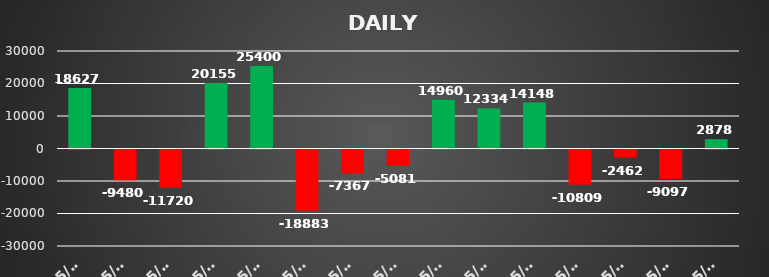
| Category | Series 0 |
|---|---|
| 2021-05-03 | 18626.5 |
| 2021-05-04 | -9480.044 |
| 2021-05-05 | -11720.077 |
| 2021-05-06 | 20155.15 |
| 2021-05-07 | 25399.875 |
| 2021-05-10 | -18883.345 |
| 2021-05-18 | -7366.725 |
| 2021-05-19 | -5081.13 |
| 2021-05-21 | 14959.934 |
| 2021-05-24 | 12334.476 |
| 2021-05-25 | 14147.7 |
| 2021-05-26 | -10809.025 |
| 2021-05-27 | -2462.376 |
| 2021-05-28 | -9097.371 |
| 2021-05-31 | 2878.135 |